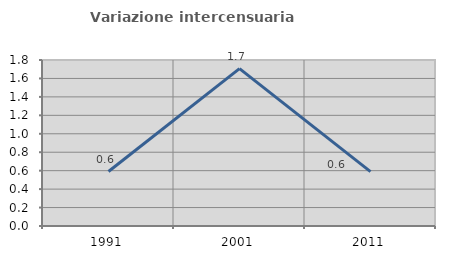
| Category | Variazione intercensuaria annua |
|---|---|
| 1991.0 | 0.591 |
| 2001.0 | 1.707 |
| 2011.0 | 0.59 |